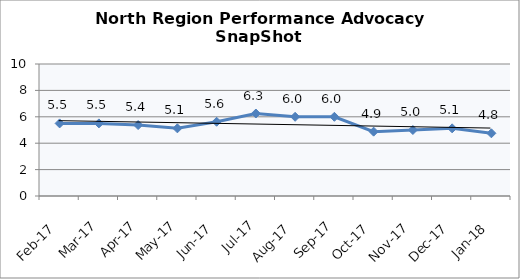
| Category | North Region |
|---|---|
| Feb-17 | 5.5 |
| Mar-17 | 5.5 |
| Apr-17 | 5.375 |
| May-17 | 5.125 |
| Jun-17 | 5.625 |
| Jul-17 | 6.25 |
| Aug-17 | 6 |
| Sep-17 | 6 |
| Oct-17 | 4.875 |
| Nov-17 | 5 |
| Dec-17 | 5.125 |
| Jan-18 | 4.75 |